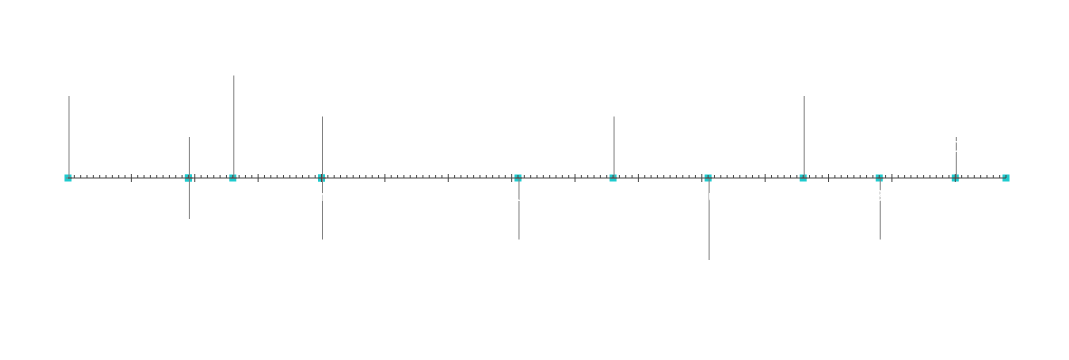
| Category | Posición |
|---|---|
| Inicio del proyecto | 20 |
| Hito 1 | 10 |
| Hito 2 | -10 |
| Hito 3 | 25 |
| Hito 4 | -15 |
| Hito 5 | 15 |
| Hito 6 | -15 |
| Hito 7 | 15 |
| Hito 8 | -20 |
| Hito 9 | 20 |
| Hito 10 | -15 |
| Hito 11 | 10 |
| Final del proyecto | 5 |